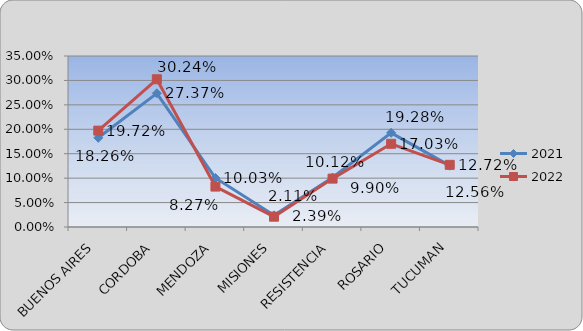
| Category | 2021 | 2022 |
|---|---|---|
| BUENOS AIRES | 0.183 | 0.197 |
| CORDOBA | 0.274 | 0.302 |
| MENDOZA | 0.1 | 0.083 |
| MISIONES | 0.024 | 0.021 |
| RESISTENCIA | 0.101 | 0.099 |
| ROSARIO | 0.193 | 0.17 |
| TUCUMAN | 0.126 | 0.127 |